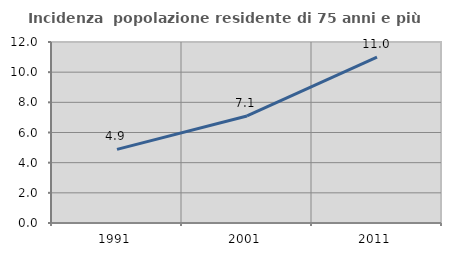
| Category | Incidenza  popolazione residente di 75 anni e più |
|---|---|
| 1991.0 | 4.884 |
| 2001.0 | 7.096 |
| 2011.0 | 10.998 |